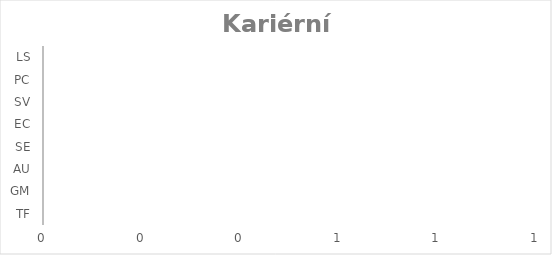
| Category | Series 0 |
|---|---|
| TF | 0 |
| GM | 0 |
| AU | 0 |
| SE | 0 |
| EC | 0 |
| SV | 0 |
| PC | 0 |
| LS | 0 |